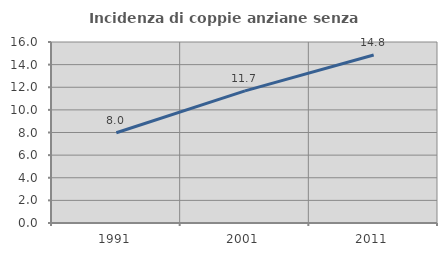
| Category | Incidenza di coppie anziane senza figli  |
|---|---|
| 1991.0 | 7.975 |
| 2001.0 | 11.677 |
| 2011.0 | 14.846 |